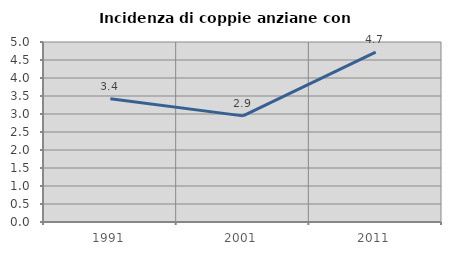
| Category | Incidenza di coppie anziane con figli |
|---|---|
| 1991.0 | 3.425 |
| 2001.0 | 2.948 |
| 2011.0 | 4.717 |